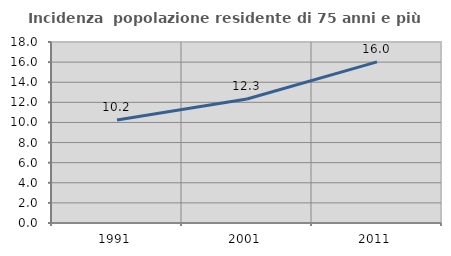
| Category | Incidenza  popolazione residente di 75 anni e più |
|---|---|
| 1991.0 | 10.235 |
| 2001.0 | 12.336 |
| 2011.0 | 16.027 |